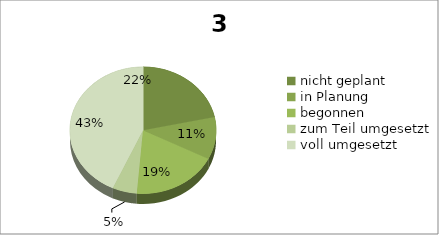
| Category | 3.1 interne Kommunikation |
|---|---|
| nicht geplant | 8 |
| in Planung | 4 |
| begonnen | 7 |
| zum Teil umgesetzt | 2 |
| voll umgesetzt | 16 |